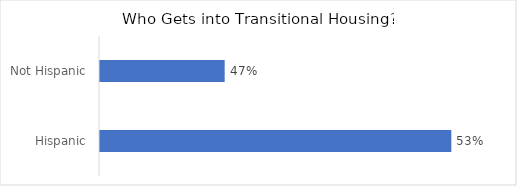
| Category | Series 0 |
|---|---|
| Hispanic | 0.533 |
| Not Hispanic | 0.467 |